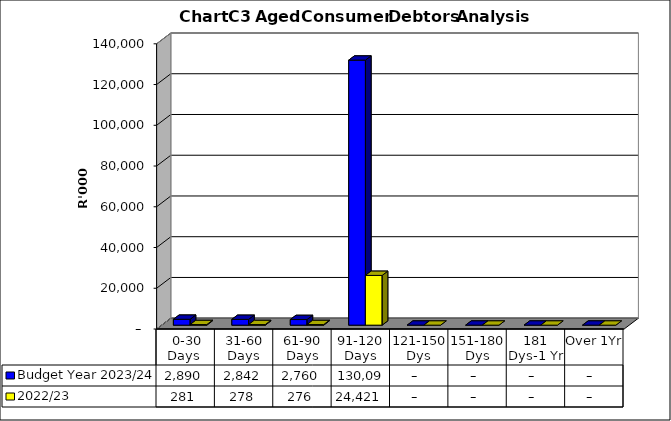
| Category | Budget Year 2023/24 | 2022/23 |
|---|---|---|
|  0-30 Days  | 2889581 | 280834 |
| 31-60 Days | 2842331 | 277647 |
| 61-90 Days | 2760236 | 275910 |
| 91-120 Days | 130098872 | 24420963 |
| 121-150 Dys | 0 | 0 |
| 151-180 Dys | 0 | 0 |
| 181 Dys-1 Yr | 0 | 0 |
| Over 1Yr | 0 | 0 |